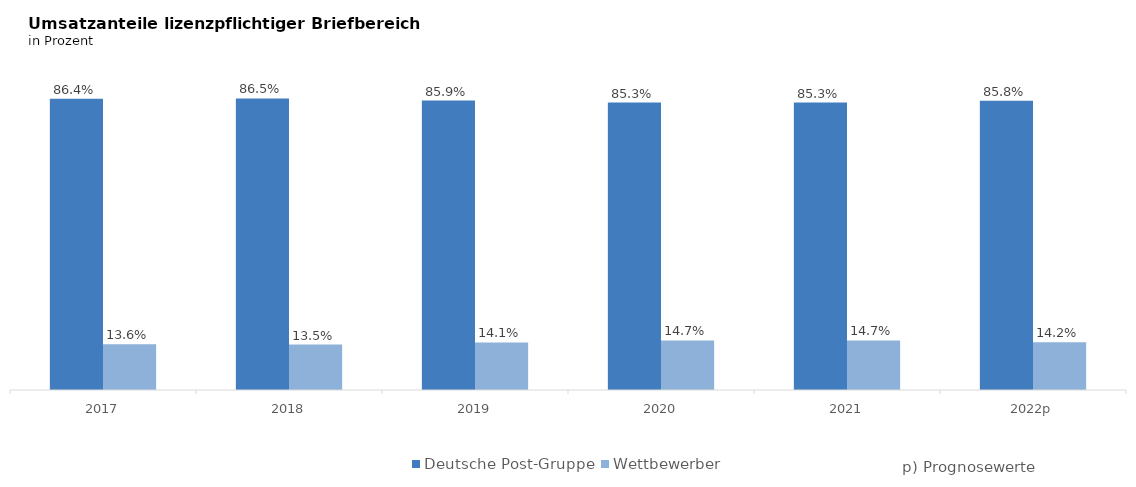
| Category | Deutsche Post-Gruppe | Wettbewerber |
|---|---|---|
| 2017 | 0.864 | 0.136 |
| 2018 | 0.865 | 0.135 |
| 2019 | 0.859 | 0.141 |
| 2020 | 0.853 | 0.147 |
| 2021 | 0.853 | 0.147 |
| 2022p | 0.858 | 0.142 |